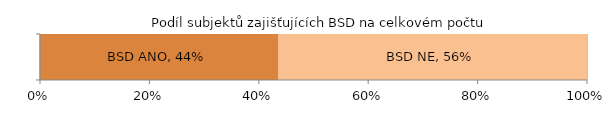
| Category | BSD ANO | BSD NE |
|---|---|---|
|  | 0.436 | 0.564 |